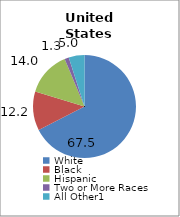
| Category | 50 states and D.C.2 |
|---|---|
| White | 67.468 |
| Black | 12.203 |
| Hispanic | 14.041 |
| Two or More Races | 1.338 |
| All Other1 | 4.951 |